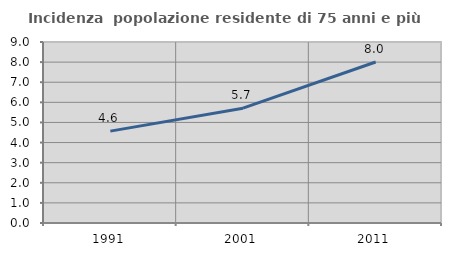
| Category | Incidenza  popolazione residente di 75 anni e più |
|---|---|
| 1991.0 | 4.569 |
| 2001.0 | 5.71 |
| 2011.0 | 8.007 |